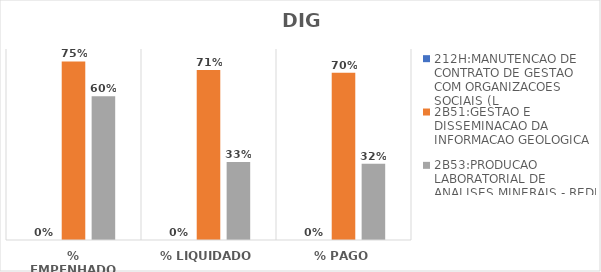
| Category | 212H:MANUTENCAO DE CONTRATO DE GESTAO COM ORGANIZACOES SOCIAIS (L | 2B51:GESTAO E DISSEMINACAO DA INFORMACAO GEOLOGICA | 2B53:PRODUCAO LABORATORIAL DE ANALISES MINERAIS - REDE LAMIN |
|---|---|---|---|
| % EMPENHADO | 0 | 0.748 | 0.602 |
| % LIQUIDADO | 0 | 0.712 | 0.327 |
| % PAGO | 0 | 0.7 | 0.319 |